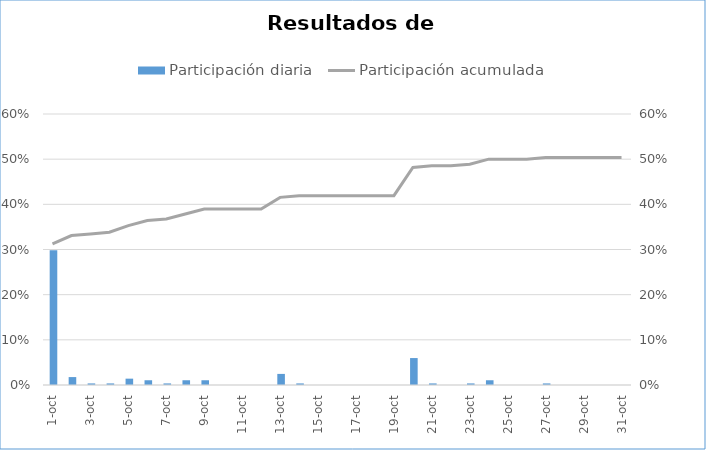
| Category | Participación diaria |
|---|---|
| 2020-10-01 | 0.298 |
| 2020-10-02 | 0.018 |
| 2020-10-03 | 0.004 |
| 2020-10-04 | 0.004 |
| 2020-10-05 | 0.014 |
| 2020-10-06 | 0.011 |
| 2020-10-07 | 0.004 |
| 2020-10-08 | 0.011 |
| 2020-10-09 | 0.011 |
| 2020-10-10 | 0 |
| 2020-10-11 | 0 |
| 2020-10-12 | 0 |
| 2020-10-13 | 0.025 |
| 2020-10-14 | 0.004 |
| 2020-10-15 | 0 |
| 2020-10-16 | 0 |
| 2020-10-17 | 0 |
| 2020-10-18 | 0 |
| 2020-10-19 | 0 |
| 2020-10-20 | 0.06 |
| 2020-10-21 | 0.004 |
| 2020-10-22 | 0 |
| 2020-10-23 | 0.004 |
| 2020-10-24 | 0.011 |
| 2020-10-25 | 0 |
| 2020-10-26 | 0 |
| 2020-10-27 | 0.004 |
| 2020-10-28 | 0 |
| 2020-10-29 | 0 |
| 2020-10-30 | 0 |
| 2020-10-31 | 0 |